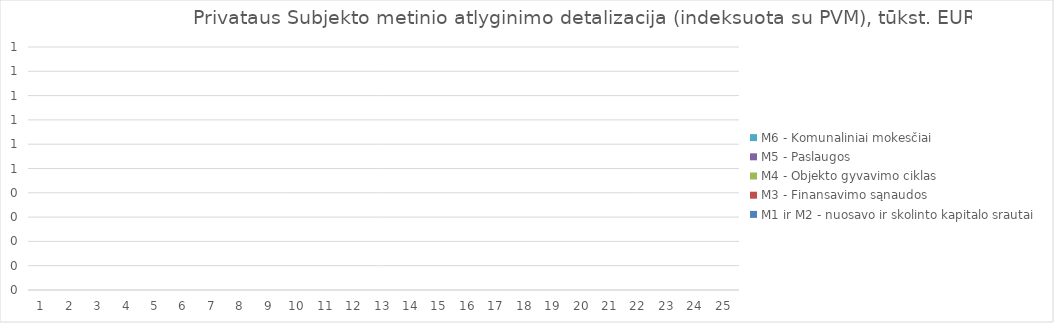
| Category | M1 ir M2 - nuosavo ir skolinto kapitalo srautai | M3 - Finansavimo sąnaudos | M4 - Objekto gyvavimo ciklas | M5 - Paslaugos | M6 - Komunaliniai mokesčiai |
|---|---|---|---|---|---|
| 1.0 | 0 | 0 | 0 | 0 | 0 |
| 2.0 | 0 | 0 | 0 | 0 | 0 |
| 3.0 | 0 | 0 | 0 | 0 | 0 |
| 4.0 | 0 | 0 | 0 | 0 | 0 |
| 5.0 | 0 | 0 | 0 | 0 | 0 |
| 6.0 | 0 | 0 | 0 | 0 | 0 |
| 7.0 | 0 | 0 | 0 | 0 | 0 |
| 8.0 | 0 | 0 | 0 | 0 | 0 |
| 9.0 | 0 | 0 | 0 | 0 | 0 |
| 10.0 | 0 | 0 | 0 | 0 | 0 |
| 11.0 | 0 | 0 | 0 | 0 | 0 |
| 12.0 | 0 | 0 | 0 | 0 | 0 |
| 13.0 | 0 | 0 | 0 | 0 | 0 |
| 14.0 | 0 | 0 | 0 | 0 | 0 |
| 15.0 | 0 | 0 | 0 | 0 | 0 |
| 16.0 | 0 | 0 | 0 | 0 | 0 |
| 17.0 | 0 | 0 | 0 | 0 | 0 |
| 18.0 | 0 | 0 | 0 | 0 | 0 |
| 19.0 | 0 | 0 | 0 | 0 | 0 |
| 20.0 | 0 | 0 | 0 | 0 | 0 |
| 21.0 | 0 | 0 | 0 | 0 | 0 |
| 22.0 | 0 | 0 | 0 | 0 | 0 |
| 23.0 | 0 | 0 | 0 | 0 | 0 |
| 24.0 | 0 | 0 | 0 | 0 | 0 |
| 25.0 | 0 | 0 | 0 | 0 | 0 |